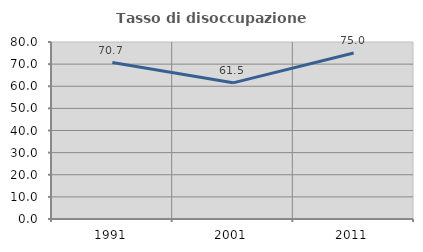
| Category | Tasso di disoccupazione giovanile  |
|---|---|
| 1991.0 | 70.69 |
| 2001.0 | 61.538 |
| 2011.0 | 75 |